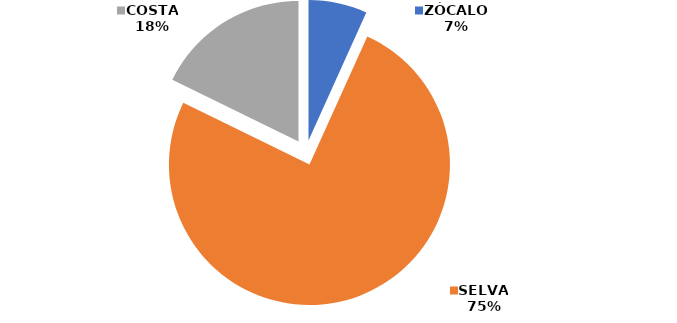
| Category | Series 0 |
|---|---|
| ZÓCALO | 3441460 |
| SELVA | 38503083 |
| COSTA | 9053686 |